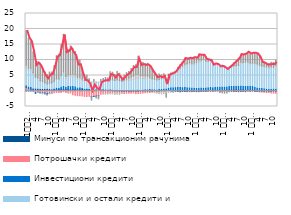
| Category | Минуси по трансакционим рачунима | Потрошачки кредити | Инвестициони кредити | Готовински и остали кредити и потраживања | Кредити за ликвидност и обртна средства | Стамбени кредити  |
|---|---|---|---|---|---|---|
| 1
2011. | 0.412 | 0.655 | 0.647 | 5.89 | 0.695 | 11.187 |
| 2 | 0.452 | 0.34 | 0.515 | 5.376 | 0.611 | 9.772 |
| 3 | 0.541 | 0.023 | 0.639 | 5.509 | 0.618 | 8.603 |
| 4 | 0.399 | -0.076 | 0.357 | 4.854 | 0.365 | 6.69 |
| 5 | 0.675 | -0.469 | -0.321 | 3.733 | 0.052 | 4.575 |
| 6 | 0.609 | -0.379 | -0.058 | 3.578 | -0.006 | 5.225 |
| 7 | 0.541 | -0.514 | -0.134 | 2.765 | -0.154 | 5.66 |
| 8 | 0.556 | -0.509 | -0.208 | 2.539 | -0.201 | 4.305 |
| 9 | 0.546 | -0.636 | -0.314 | 2.083 | -0.156 | 3.467 |
| 10 | 0.684 | -0.802 | -0.386 | 1.58 | -0.169 | 3.048 |
| 11 | 0.529 | -0.704 | -0.115 | 1.911 | -0.125 | 3.651 |
| 12 | 0.401 | -0.688 | -0.061 | 2.263 | -0.026 | 3.458 |
| 1 
2012. | 0.483 | -0.601 | 0.179 | 2.38 | 0.085 | 5.103 |
| 2 | 0.517 | -0.461 | 0.426 | 2.788 | 0.216 | 7.456 |
| 3 | 0.497 | -0.497 | 0.333 | 2.929 | 0.202 | 7.882 |
| 4 | 0.653 | -0.495 | 0.639 | 3.42 | 0.397 | 9.858 |
| 5 | 0.479 | -0.228 | 1.036 | 4.016 | 0.643 | 12.117 |
| 6 | 0.463 | -0.504 | 0.735 | 2.868 | 0.581 | 8.255 |
| 7 | 0.615 | -0.629 | 0.883 | 3.059 | 0.671 | 8.156 |
| 8 | 0.511 | -0.685 | 0.92 | 3.286 | 0.623 | 9.179 |
| 9 | 0.57 | -1.197 | 0.855 | 3.494 | 0.533 | 8.168 |
| 10 | 0.499 | -1.347 | 0.833 | 3.374 | 0.583 | 7.473 |
| 11 | 0.441 | -1.518 | 0.548 | 2.875 | 0.558 | 5.484 |
| 12 | 0.547 | -1.551 | 0.518 | 2.923 | 0.424 | 5.605 |
| 1 
2013. | 0.534 | -1.639 | 0.244 | 2.781 | 0.336 | 3.424 |
| 2 | 0.464 | -1.746 | 0.136 | 2.519 | 0.345 | 1.739 |
| 3 | 0.403 | -1.75 | 0.211 | 2.364 | 0.551 | 1.523 |
| 4 | 0.367 | -1.728 | 0.106 | 2.442 | 0.443 | 0.625 |
| 5 | 0.422 | -1.787 | -0.089 | 2.234 | 0.268 | -1.06 |
| 6 | 0.35 | -1.762 | -0.003 | 2.534 | 0.284 | 0.514 |
| 7 | 0.368 | -1.594 | -0.112 | 2.477 | 0.167 | -0.521 |
| 8 | 0.27 | -1.512 | -0.065 | 2.443 | 0.164 | -0.958 |
| 9 | 0.281 | -1.039 | 0.085 | 2.565 | 0.137 | 0.618 |
| 10 | 0.297 | -0.902 | 0.094 | 2.751 | -0.038 | 0.92 |
| 11 | 0.235 | -0.834 | 0.111 | 2.917 | -0.198 | 1.086 |
| 12 | 0.178 | -0.794 | 0.137 | 3.055 | -0.187 | 0.825 |
| 1 
2014. | 0.163 | -0.699 | 0.277 | 3.189 | -0.19 | 2.556 |
| 2 | 0.048 | -0.663 | 0.268 | 3.222 | -0.281 | 2.509 |
| 3 | 0.094 | -0.639 | 0.145 | 3.155 | -0.482 | 1.937 |
| 4 | 0.088 | -0.627 | 0.19 | 3.33 | -0.426 | 2.677 |
| 5 | -0.105 | -0.664 | 0.143 | 3.214 | -0.396 | 2.371 |
| 6 | 0.02 | -0.711 | 0.058 | 3.05 | -0.048 | 1.15 |
| 7 | -0.1 | -0.682 | 0.09 | 3.139 | 0.32 | 1.577 |
| 8 | -0.098 | -0.654 | 0.11 | 3.183 | 0.501 | 2.094 |
| 9 | -0.08 | -0.621 | 0.121 | 3.302 | 0.69 | 2.174 |
| 10 | -0.148 | -0.547 | 0.189 | 3.422 | 0.932 | 2.703 |
| 11 | -0.14 | -0.49 | 0.303 | 3.457 | 1.081 | 3.394 |
| 12 | -0.095 | -0.791 | 0.278 | 3.755 | 1.17 | 3.247 |
| 1 
2015. | -0.102 | -0.722 | 0.343 | 3.859 | 1.114 | 5.922 |
| 2 | 0.048 | -0.737 | 0.195 | 3.693 | 0.973 | 4.049 |
| 3 | 0.078 | -0.685 | 0.247 | 3.711 | 0.922 | 4.24 |
| 4 | 0.096 | -0.603 | 0.301 | 3.6 | 0.83 | 4.023 |
| 5 | 0.037 | -0.521 | 0.362 | 3.61 | 0.768 | 4.168 |
| 6 | 0.047 | -0.467 | 0.415 | 3.593 | 0.376 | 3.844 |
| 7 | 0.01 | -0.442 | 0.394 | 3.467 | 0.046 | 2.992 |
| 8 | 0.058 | -0.421 | 0.347 | 3.375 | -0.145 | 2.149 |
| 9 | -0.026 | -0.39 | 0.351 | 3.171 | -0.321 | 1.521 |
| 10 | -0.033 | -0.351 | 0.468 | 3.212 | -0.479 | 1.792 |
| 11 | 0.007 | -0.339 | 0.508 | 3.448 | -0.579 | 1.257 |
| 12 | -0.087 | -0.021 | 0.654 | 3.571 | -0.681 | 1.317 |
| 1 
2016. | -0.12 | -0.038 | 0.641 | 3.491 | -0.582 | -1.316 |
| 2 | -0.042 | 0.034 | 0.85 | 4.034 | -0.388 | 0.549 |
| 3 | -0.146 | 0.068 | 0.978 | 4.402 | -0.247 | 0.342 |
| 4 | -0.279 | 0.073 | 0.987 | 4.704 | -0.079 | 0.284 |
| 5 | -0.104 | 0.08 | 1.024 | 4.983 | 0.065 | 0.197 |
| 6 | -0.168 | 0.079 | 1.041 | 5.596 | 0.173 | 0.726 |
| 7 | -0.246 | 0.06 | 1.047 | 5.984 | 0.279 | 1.219 |
| 8 | -0.148 | 0.032 | 1.055 | 6.604 | 0.344 | 1.416 |
| 9 | -0.173 | 0.016 | 1.155 | 7.068 | 0.395 | 1.995 |
| 10 | -0.17 | -0.034 | 1.081 | 7.378 | 0.419 | 1.611 |
| 11 | -0.167 | -0.049 | 1.027 | 7.505 | 0.514 | 1.711 |
| 12 | -0.193 | -0.032 | 0.941 | 7.407 | 0.605 | 1.754 |
| 1 
2017. | -0.102 | -0.027 | 0.885 | 7.565 | 0.588 | 1.859 |
| 2 | -0.198 | -0.035 | 0.861 | 7.805 | 0.569 | 1.613 |
| 3 | -0.199 | -0.038 | 0.923 | 8.434 | 0.586 | 1.952 |
| 4 | -0.146 | -0.037 | 0.934 | 8.569 | 0.503 | 1.701 |
| 5 | -0.133 | -0.019 | 0.947 | 8.866 | 0.381 | 1.497 |
| 6 | -0.143 | -0.005 | 0.956 | 8.461 | 0.279 | 0.718 |
| 7 | -0.013 | 0.059 | 1.006 | 8.414 | 0.228 | 0.316 |
| 8 | -0.025 | 0.139 | 1.036 | 8.408 | 0.243 | 0.065 |
| 9 | -0.092 | 0.1 | 0.927 | 7.393 | 0.137 | -0.102 |
| 10 | -0.014 | 0.192 | 0.97 | 7.392 | 0.168 | 0.026 |
| 11 | -0.022 | 0.255 | 0.969 | 7.332 | -0.021 | 0.031 |
| 12 | -0.054 | 0.254 | 1.01 | 7.075 | 0.005 | -0.47 |
| 1 
2018. | -0.078 | 0.267 | 1.018 | 7.202 | -0.006 | -0.505 |
| 2 | -0.108 | 0.303 | 1.009 | 6.927 | -0.048 | -0.54 |
| 3 | -0.106 | 0.351 | 0.969 | 6.266 | -0.121 | -0.413 |
| 4 | -0.078 | 0.403 | 1.023 | 6.374 | -0.082 | -0.072 |
| 5 | -0.111 | 0.436 | 1.041 | 6.367 | 0.005 | 0.451 |
| 6 | -0.162 | 0.469 | 1.039 | 6.51 | 0.094 | 1.001 |
| 7 | -0.142 | 0.466 | 1.069 | 6.621 | 0.085 | 1.514 |
| 8 | -0.222 | 0.46 | 1.118 | 6.626 | 0.077 | 2.32 |
| 9 | -0.138 | 0.484 | 1.165 | 7.501 | 0.187 | 2.546 |
| 10 | -0.123 | 0.428 | 1.132 | 7.506 | 0.141 | 2.551 |
| 11 | -0.204 | 0.371 | 1.18 | 7.593 | 0.288 | 2.69 |
| 12 | -0.005 | 0.361 | 1.199 | 7.598 | 0.252 | 3.102 |
| 1 
2019. | -0.044 | 0.337 | 1.157 | 7.26 | 0.26 | 2.996 |
| 2 | -0.024 | 0.282 | 1.169 | 7.277 | 0.272 | 3.201 |
| 3 | -0.041 | -0.02 | 1.116 | 7.653 | 0.274 | 3.178 |
| 4 | -0.041 | -0.073 | 0.939 | 7.495 | 0.345 | 3.283 |
| 5 | -0.1 | -0.229 | 0.83 | 7.254 | 0.327 | 2.858 |
| 6 | -0.031 | -0.277 | 0.797 | 7.041 | 0.319 | 1.374 |
| 7 | -0.025 | -0.342 | 0.694 | 7.026 | 0.359 | 1.27 |
| 8 | -0.025 | -0.5 | 0.607 | 6.842 | 0.369 | 1.125 |
| 9 | 0.002 | -0.514 | 0.56 | 6.884 | 0.317 | 1.12 |
| 10 | -0.05 | -0.604 | 0.592 | 6.912 | 0.362 | 1.371 |
| 11 | 0.007 | -0.709 | 0.641 | 6.893 | 0.208 | 1.453 |
| 12 | -0.045 | -0.706 | 0.566 | 7.496 | 0.299 | 1.641 |